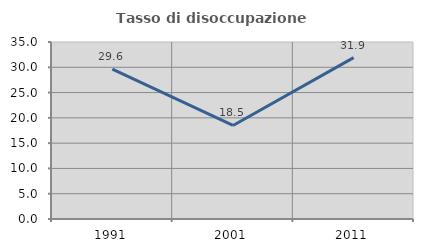
| Category | Tasso di disoccupazione giovanile  |
|---|---|
| 1991.0 | 29.65 |
| 2001.0 | 18.493 |
| 2011.0 | 31.905 |